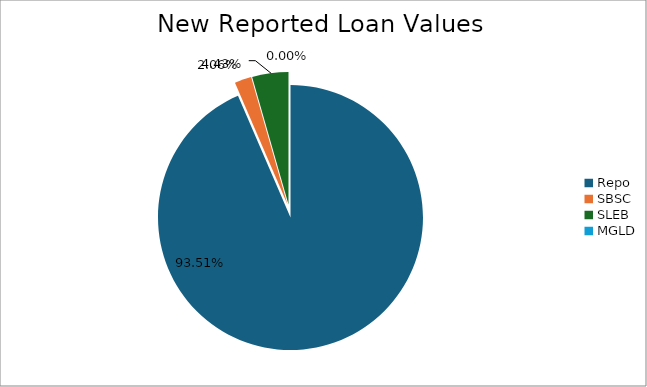
| Category | Series 0 |
|---|---|
| Repo | 10770774.69 |
| SBSC | 237373.66 |
| SLEB | 509721.94 |
| MGLD | 36.91 |